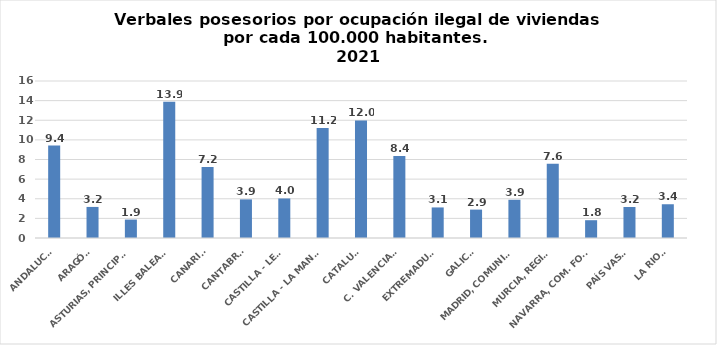
| Category | Series 0 |
|---|---|
| ANDALUCÍA | 9.419 |
| ARAGÓN | 3.167 |
| ASTURIAS, PRINCIPADO | 1.878 |
| ILLES BALEARS | 13.896 |
| CANARIAS | 7.225 |
| CANTABRIA | 3.935 |
| CASTILLA - LEÓN | 4.028 |
| CASTILLA - LA MANCHA | 11.222 |
| CATALUÑA | 11.979 |
| C. VALENCIANA | 8.363 |
| EXTREMADURA | 3.115 |
| GALICIA | 2.894 |
| MADRID, COMUNIDAD | 3.896 |
| MURCIA, REGIÓN | 7.573 |
| NAVARRA, COM. FORAL | 1.814 |
| PAÍS VASCO | 3.162 |
| LA RIOJA | 3.44 |